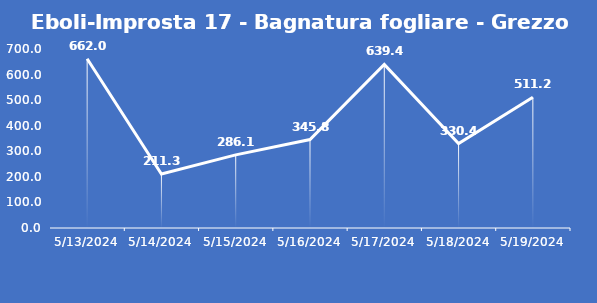
| Category | Eboli-Improsta 17 - Bagnatura fogliare - Grezzo (min) |
|---|---|
| 5/13/24 | 662 |
| 5/14/24 | 211.3 |
| 5/15/24 | 286.1 |
| 5/16/24 | 345.8 |
| 5/17/24 | 639.4 |
| 5/18/24 | 330.4 |
| 5/19/24 | 511.2 |